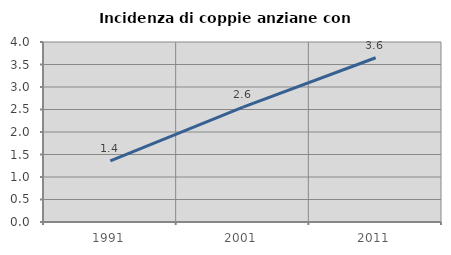
| Category | Incidenza di coppie anziane con figli |
|---|---|
| 1991.0 | 1.358 |
| 2001.0 | 2.554 |
| 2011.0 | 3.65 |